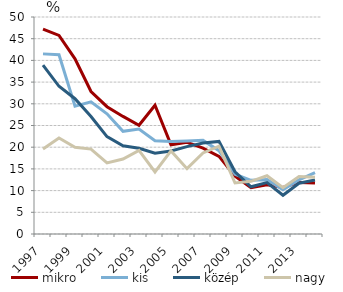
| Category | mikro | kis | közép | nagy |
|---|---|---|---|---|
| 1997.0 | 47.199 | 41.504 | 38.915 | 19.565 |
| 1998.0 | 45.755 | 41.312 | 34.03 | 22.117 |
| 1999.0 | 40.365 | 29.45 | 31.173 | 20 |
| 2000.0 | 32.831 | 30.451 | 27.062 | 19.561 |
| 2001.0 | 29.33 | 27.695 | 22.437 | 16.393 |
| 2002.0 | 27.093 | 23.656 | 20.334 | 17.287 |
| 2003.0 | 25.061 | 24.179 | 19.751 | 19.275 |
| 2004.0 | 29.668 | 21.484 | 18.613 | 14.295 |
| 2005.0 | 20.557 | 21.304 | 19.137 | 19.139 |
| 2006.0 | 21.115 | 21.444 | 20.14 | 15.062 |
| 2007.0 | 19.799 | 21.573 | 20.976 | 18.675 |
| 2008.0 | 17.896 | 19.209 | 21.331 | 20.221 |
| 2009.0 | 13.351 | 13.784 | 14.347 | 11.75 |
| 2010.0 | 10.655 | 12.374 | 10.878 | 12.132 |
| 2011.0 | 11.363 | 12.526 | 11.855 | 13.415 |
| 2012.0 | 10.745 | 10.173 | 8.933 | 10.667 |
| 2013.0 | 11.888 | 12.457 | 11.7 | 13.269 |
| 2014.0 | 11.734 | 14.144 | 12.44 | 13.084 |